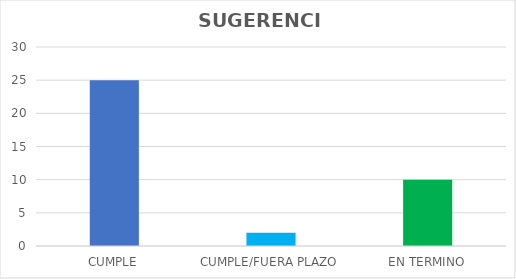
| Category | TOTAL |
|---|---|
| CUMPLE | 25 |
| CUMPLE/FUERA PLAZO | 2 |
| EN TERMINO | 10 |